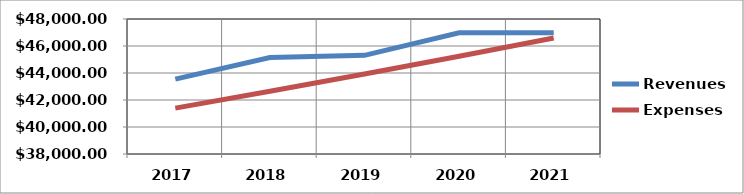
| Category | Revenues | Expenses |
|---|---|---|
| 2017.0 | 43550 | 41400 |
| 2018.0 | 45150 | 42642 |
| 2019.0 | 45307.5 | 43921 |
| 2020.0 | 46975 | 45239 |
| 2021.0 | 46975 | 46596 |